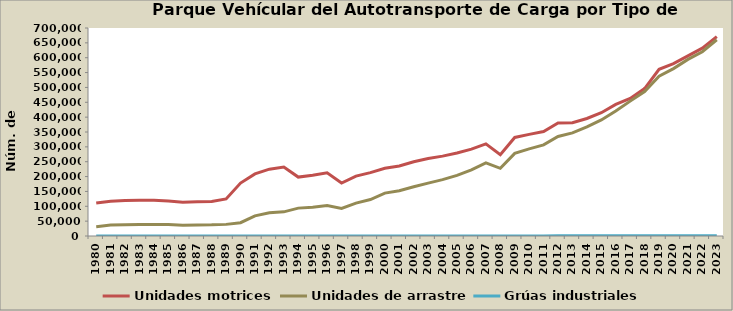
| Category | Unidades motrices | Unidades de arrastre | Grúas industriales |
|---|---|---|---|
| 1980.0 | 110810 | 31120 | 0 |
| 1981.0 | 117090 | 36760 | 0 |
| 1982.0 | 119309 | 38216 | 0 |
| 1983.0 | 120702 | 38639 | 0 |
| 1984.0 | 120702 | 38639 | 0 |
| 1985.0 | 117956 | 38317 | 0 |
| 1986.0 | 114000 | 36500 | 0 |
| 1987.0 | 115092 | 37245 | 0 |
| 1988.0 | 115897 | 37506 | 0 |
| 1989.0 | 124897 | 39113 | 0 |
| 1990.0 | 178130 | 44853 | 0 |
| 1991.0 | 209060 | 67865 | 0 |
| 1992.0 | 224913 | 78233 | 0 |
| 1993.0 | 232203 | 81307 | 0 |
| 1994.0 | 198273 | 93827 | 0 |
| 1995.0 | 204117 | 96638 | 0 |
| 1996.0 | 212909 | 102409 | 0 |
| 1997.0 | 178332 | 92999 | 0 |
| 1998.0 | 201587 | 110530 | 0 |
| 1999.0 | 213292 | 122619 | 126 |
| 2000.0 | 227847 | 144225 | 191 |
| 2001.0 | 235767 | 152341 | 212 |
| 2002.0 | 250025 | 165601 | 221 |
| 2003.0 | 260645 | 177864 | 251 |
| 2004.0 | 268725 | 189568 | 256 |
| 2005.0 | 279112 | 204186 | 266 |
| 2006.0 | 292418 | 222580 | 281 |
| 2007.0 | 310013 | 245843 | 294 |
| 2008.0 | 273455 | 227806 | 277 |
| 2009.0 | 331686 | 278133 | 329 |
| 2010.0 | 342064 | 293053 | 351 |
| 2011.0 | 351705 | 306700 | 355 |
| 2012.0 | 380342 | 334858 | 483 |
| 2013.0 | 381250 | 347112 | 684 |
| 2014.0 | 395552 | 367051 | 877 |
| 2015.0 | 414790 | 390563 | 1052 |
| 2016.0 | 443058 | 420553 | 1224 |
| 2017.0 | 463016 | 453916 | 449 |
| 2018.0 | 496057 | 486335 | 464 |
| 2019.0 | 561061 | 537813 | 497 |
| 2020.0 | 580035 | 563400 | 505 |
| 2021.0 | 606090 | 594443 | 520 |
| 2022.0 | 632252 | 620240 | 528 |
| 2023.0 | 671002 | 660365 | 554 |